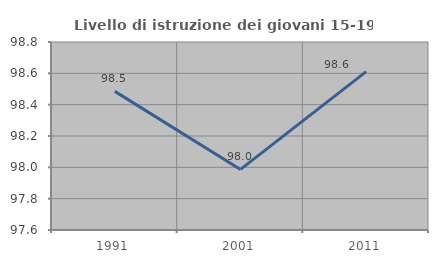
| Category | Livello di istruzione dei giovani 15-19 anni |
|---|---|
| 1991.0 | 98.485 |
| 2001.0 | 97.987 |
| 2011.0 | 98.611 |